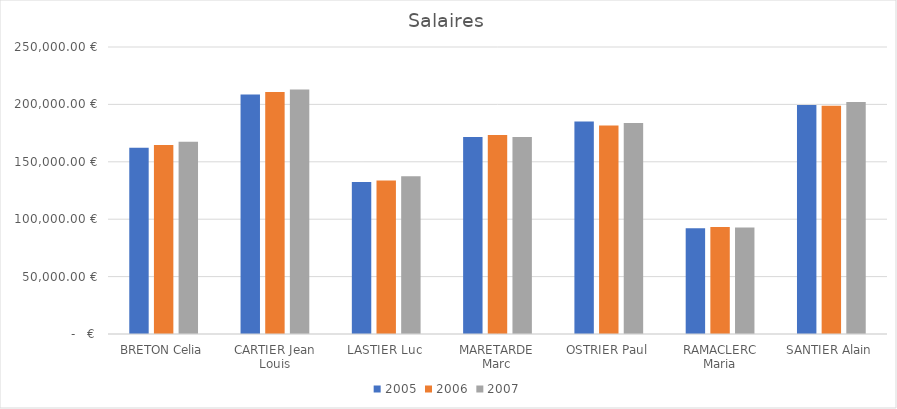
| Category | 2005 | 2006 | 2007 |
|---|---|---|---|
| BRETON Celia | 162240 | 164720 | 167480 |
| CARTIER Jean Louis | 208550 | 210760 | 212950 |
| LASTIER Luc | 132300 | 133620 | 137440 |
| MARETARDE Marc | 171646 | 173445 | 171620 |
| OSTRIER Paul | 185130 | 181530 | 183750 |
| RAMACLERC Maria | 92120 | 93160 | 92720 |
| SANTIER Alain | 199485 | 198800 | 202120 |